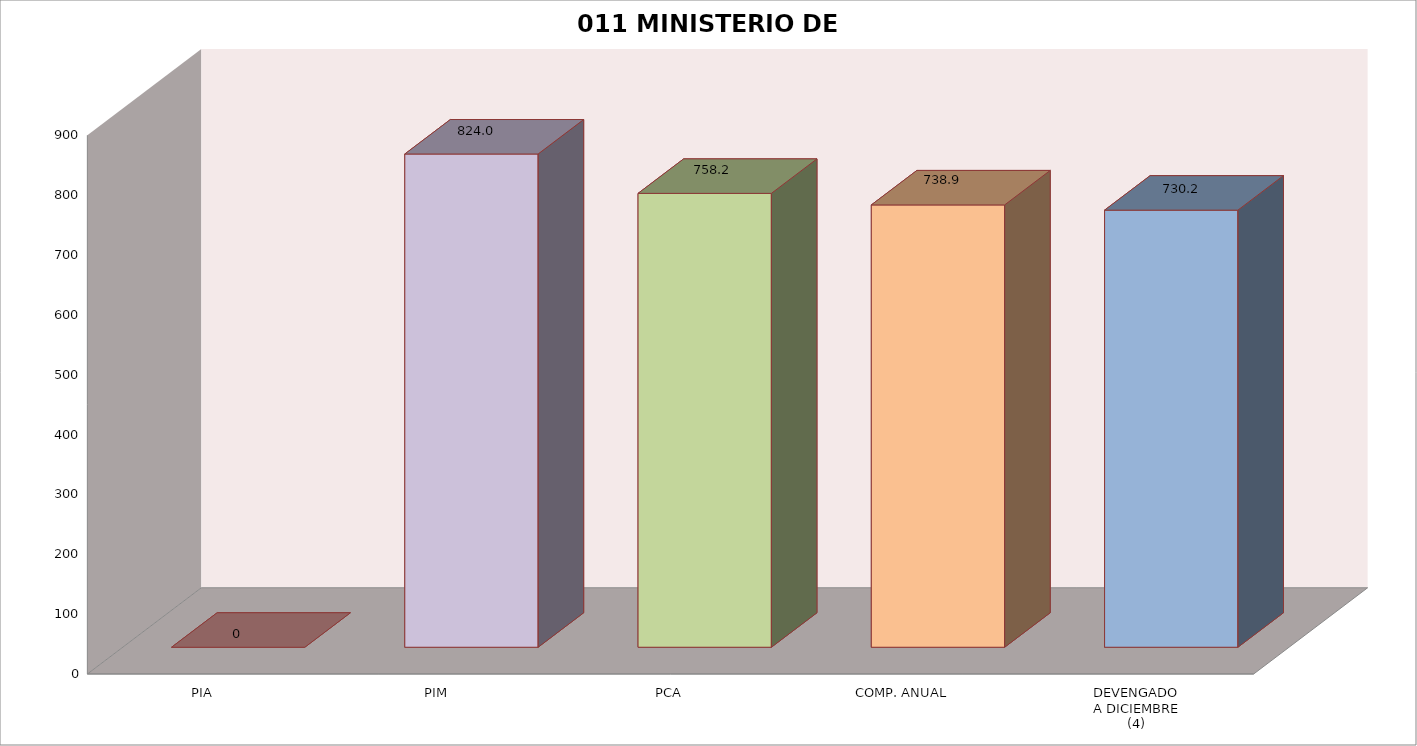
| Category | 011 MINISTERIO DE SALUD |
|---|---|
| PIA | 0 |
| PIM | 823.959 |
| PCA | 758.197 |
| COMP. ANUAL | 738.914 |
| DEVENGADO
A DICIEMBRE
(4) | 730.196 |